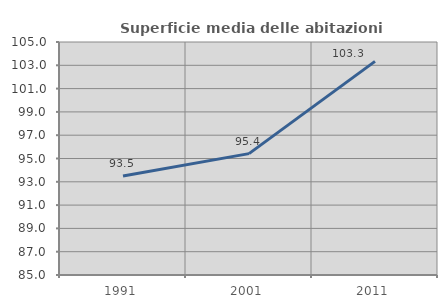
| Category | Superficie media delle abitazioni occupate |
|---|---|
| 1991.0 | 93.501 |
| 2001.0 | 95.42 |
| 2011.0 | 103.339 |